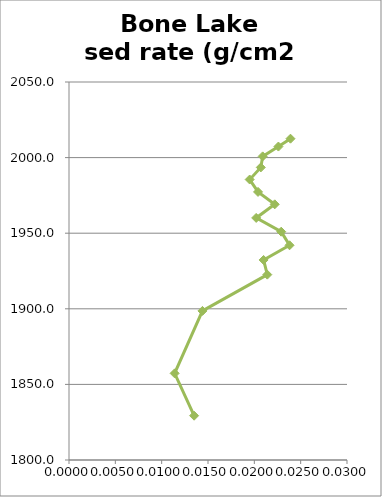
| Category | sed rate (g/cm2 yr) |
|---|---|
| 0.0239 | 2012.5 |
| 0.0226 | 2007.3 |
| 0.0209 | 2000.8 |
| 0.0207 | 1993.5 |
| 0.0195 | 1985.5 |
| 0.0204 | 1977.3 |
| 0.0222 | 1969.1 |
| 0.0202 | 1960.1 |
| 0.0229 | 1951 |
| 0.0238 | 1942 |
| 0.021 | 1932.3 |
| 0.0214 | 1922.6 |
| 0.0144 | 1898.6 |
| 0.0114 | 1857.3 |
| 0.0135 | 1829.3 |